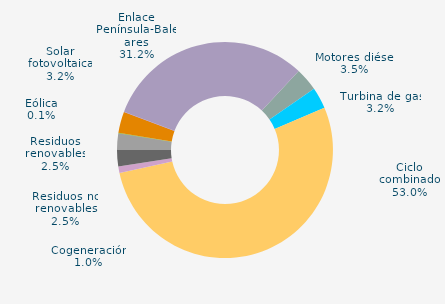
| Category | Series 0 |
|---|---|
| Carbón | 0 |
| Motores diésel | 3.469 |
| Turbina de gas | 3.199 |
| Ciclo combinado | 52.973 |
| Generación auxiliar | -0.001 |
| Cogeneración | 0.973 |
| Residuos no renovables | 2.458 |
| Residuos renovables | 2.458 |
| Eólica | 0.075 |
| Solar fotovoltaica | 3.188 |
| Otras renovables | 0.034 |
| Enlace Península-Baleares | 31.174 |